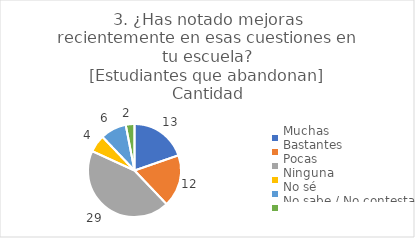
| Category | 3. ¿Has notado mejoras recientemente en esas cuestiones en tu escuela?
[Estudiantes que abandonan] |
|---|---|
| Muchas  | 0.197 |
| Bastantes  | 0.182 |
| Pocas  | 0.439 |
| Ninguna  | 0.061 |
| No sé  | 0.091 |
| No sabe / No contesta | 0.03 |